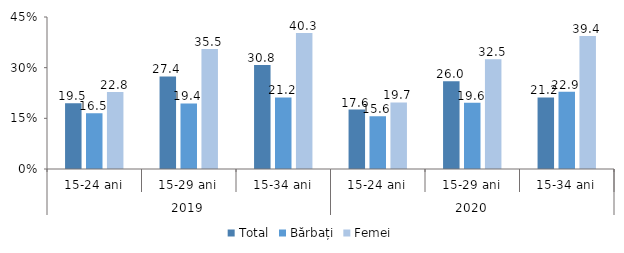
| Category | Total | Bărbați | Femei |
|---|---|---|---|
| 0 | 19.5 | 16.5 | 22.8 |
| 1 | 27.4 | 19.4 | 35.5 |
| 2 | 30.8 | 21.2 | 40.3 |
| 3 | 17.6 | 15.6 | 19.7 |
| 4 | 26 | 19.6 | 32.5 |
| 5 | 21.2 | 22.9 | 39.4 |